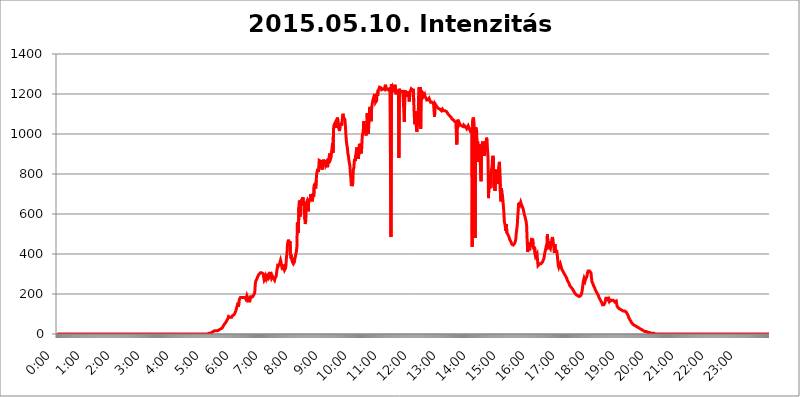
| Category | 2015.05.10. Intenzitás [W/m^2] |
|---|---|
| 0.0 | 0 |
| 0.0006944444444444445 | 0 |
| 0.001388888888888889 | 0 |
| 0.0020833333333333333 | 0 |
| 0.002777777777777778 | 0 |
| 0.003472222222222222 | 0 |
| 0.004166666666666667 | 0 |
| 0.004861111111111111 | 0 |
| 0.005555555555555556 | 0 |
| 0.0062499999999999995 | 0 |
| 0.006944444444444444 | 0 |
| 0.007638888888888889 | 0 |
| 0.008333333333333333 | 0 |
| 0.009027777777777779 | 0 |
| 0.009722222222222222 | 0 |
| 0.010416666666666666 | 0 |
| 0.011111111111111112 | 0 |
| 0.011805555555555555 | 0 |
| 0.012499999999999999 | 0 |
| 0.013194444444444444 | 0 |
| 0.013888888888888888 | 0 |
| 0.014583333333333332 | 0 |
| 0.015277777777777777 | 0 |
| 0.015972222222222224 | 0 |
| 0.016666666666666666 | 0 |
| 0.017361111111111112 | 0 |
| 0.018055555555555557 | 0 |
| 0.01875 | 0 |
| 0.019444444444444445 | 0 |
| 0.02013888888888889 | 0 |
| 0.020833333333333332 | 0 |
| 0.02152777777777778 | 0 |
| 0.022222222222222223 | 0 |
| 0.02291666666666667 | 0 |
| 0.02361111111111111 | 0 |
| 0.024305555555555556 | 0 |
| 0.024999999999999998 | 0 |
| 0.025694444444444447 | 0 |
| 0.02638888888888889 | 0 |
| 0.027083333333333334 | 0 |
| 0.027777777777777776 | 0 |
| 0.02847222222222222 | 0 |
| 0.029166666666666664 | 0 |
| 0.029861111111111113 | 0 |
| 0.030555555555555555 | 0 |
| 0.03125 | 0 |
| 0.03194444444444445 | 0 |
| 0.03263888888888889 | 0 |
| 0.03333333333333333 | 0 |
| 0.034027777777777775 | 0 |
| 0.034722222222222224 | 0 |
| 0.035416666666666666 | 0 |
| 0.036111111111111115 | 0 |
| 0.03680555555555556 | 0 |
| 0.0375 | 0 |
| 0.03819444444444444 | 0 |
| 0.03888888888888889 | 0 |
| 0.03958333333333333 | 0 |
| 0.04027777777777778 | 0 |
| 0.04097222222222222 | 0 |
| 0.041666666666666664 | 0 |
| 0.042361111111111106 | 0 |
| 0.04305555555555556 | 0 |
| 0.043750000000000004 | 0 |
| 0.044444444444444446 | 0 |
| 0.04513888888888889 | 0 |
| 0.04583333333333334 | 0 |
| 0.04652777777777778 | 0 |
| 0.04722222222222222 | 0 |
| 0.04791666666666666 | 0 |
| 0.04861111111111111 | 0 |
| 0.049305555555555554 | 0 |
| 0.049999999999999996 | 0 |
| 0.05069444444444445 | 0 |
| 0.051388888888888894 | 0 |
| 0.052083333333333336 | 0 |
| 0.05277777777777778 | 0 |
| 0.05347222222222222 | 0 |
| 0.05416666666666667 | 0 |
| 0.05486111111111111 | 0 |
| 0.05555555555555555 | 0 |
| 0.05625 | 0 |
| 0.05694444444444444 | 0 |
| 0.057638888888888885 | 0 |
| 0.05833333333333333 | 0 |
| 0.05902777777777778 | 0 |
| 0.059722222222222225 | 0 |
| 0.06041666666666667 | 0 |
| 0.061111111111111116 | 0 |
| 0.06180555555555556 | 0 |
| 0.0625 | 0 |
| 0.06319444444444444 | 0 |
| 0.06388888888888888 | 0 |
| 0.06458333333333334 | 0 |
| 0.06527777777777778 | 0 |
| 0.06597222222222222 | 0 |
| 0.06666666666666667 | 0 |
| 0.06736111111111111 | 0 |
| 0.06805555555555555 | 0 |
| 0.06874999999999999 | 0 |
| 0.06944444444444443 | 0 |
| 0.07013888888888889 | 0 |
| 0.07083333333333333 | 0 |
| 0.07152777777777779 | 0 |
| 0.07222222222222223 | 0 |
| 0.07291666666666667 | 0 |
| 0.07361111111111111 | 0 |
| 0.07430555555555556 | 0 |
| 0.075 | 0 |
| 0.07569444444444444 | 0 |
| 0.0763888888888889 | 0 |
| 0.07708333333333334 | 0 |
| 0.07777777777777778 | 0 |
| 0.07847222222222222 | 0 |
| 0.07916666666666666 | 0 |
| 0.0798611111111111 | 0 |
| 0.08055555555555556 | 0 |
| 0.08125 | 0 |
| 0.08194444444444444 | 0 |
| 0.08263888888888889 | 0 |
| 0.08333333333333333 | 0 |
| 0.08402777777777777 | 0 |
| 0.08472222222222221 | 0 |
| 0.08541666666666665 | 0 |
| 0.08611111111111112 | 0 |
| 0.08680555555555557 | 0 |
| 0.08750000000000001 | 0 |
| 0.08819444444444445 | 0 |
| 0.08888888888888889 | 0 |
| 0.08958333333333333 | 0 |
| 0.09027777777777778 | 0 |
| 0.09097222222222222 | 0 |
| 0.09166666666666667 | 0 |
| 0.09236111111111112 | 0 |
| 0.09305555555555556 | 0 |
| 0.09375 | 0 |
| 0.09444444444444444 | 0 |
| 0.09513888888888888 | 0 |
| 0.09583333333333333 | 0 |
| 0.09652777777777777 | 0 |
| 0.09722222222222222 | 0 |
| 0.09791666666666667 | 0 |
| 0.09861111111111111 | 0 |
| 0.09930555555555555 | 0 |
| 0.09999999999999999 | 0 |
| 0.10069444444444443 | 0 |
| 0.1013888888888889 | 0 |
| 0.10208333333333335 | 0 |
| 0.10277777777777779 | 0 |
| 0.10347222222222223 | 0 |
| 0.10416666666666667 | 0 |
| 0.10486111111111111 | 0 |
| 0.10555555555555556 | 0 |
| 0.10625 | 0 |
| 0.10694444444444444 | 0 |
| 0.1076388888888889 | 0 |
| 0.10833333333333334 | 0 |
| 0.10902777777777778 | 0 |
| 0.10972222222222222 | 0 |
| 0.1111111111111111 | 0 |
| 0.11180555555555556 | 0 |
| 0.11180555555555556 | 0 |
| 0.1125 | 0 |
| 0.11319444444444444 | 0 |
| 0.11388888888888889 | 0 |
| 0.11458333333333333 | 0 |
| 0.11527777777777777 | 0 |
| 0.11597222222222221 | 0 |
| 0.11666666666666665 | 0 |
| 0.1173611111111111 | 0 |
| 0.11805555555555557 | 0 |
| 0.11944444444444445 | 0 |
| 0.12013888888888889 | 0 |
| 0.12083333333333333 | 0 |
| 0.12152777777777778 | 0 |
| 0.12222222222222223 | 0 |
| 0.12291666666666667 | 0 |
| 0.12291666666666667 | 0 |
| 0.12361111111111112 | 0 |
| 0.12430555555555556 | 0 |
| 0.125 | 0 |
| 0.12569444444444444 | 0 |
| 0.12638888888888888 | 0 |
| 0.12708333333333333 | 0 |
| 0.16875 | 0 |
| 0.12847222222222224 | 0 |
| 0.12916666666666668 | 0 |
| 0.12986111111111112 | 0 |
| 0.13055555555555556 | 0 |
| 0.13125 | 0 |
| 0.13194444444444445 | 0 |
| 0.1326388888888889 | 0 |
| 0.13333333333333333 | 0 |
| 0.13402777777777777 | 0 |
| 0.13402777777777777 | 0 |
| 0.13472222222222222 | 0 |
| 0.13541666666666666 | 0 |
| 0.1361111111111111 | 0 |
| 0.13749999999999998 | 0 |
| 0.13819444444444443 | 0 |
| 0.1388888888888889 | 0 |
| 0.13958333333333334 | 0 |
| 0.14027777777777778 | 0 |
| 0.14097222222222222 | 0 |
| 0.14166666666666666 | 0 |
| 0.1423611111111111 | 0 |
| 0.14305555555555557 | 0 |
| 0.14375000000000002 | 0 |
| 0.14444444444444446 | 0 |
| 0.1451388888888889 | 0 |
| 0.1451388888888889 | 0 |
| 0.14652777777777778 | 0 |
| 0.14722222222222223 | 0 |
| 0.14791666666666667 | 0 |
| 0.1486111111111111 | 0 |
| 0.14930555555555555 | 0 |
| 0.15 | 0 |
| 0.15069444444444444 | 0 |
| 0.15138888888888888 | 0 |
| 0.15208333333333332 | 0 |
| 0.15277777777777776 | 0 |
| 0.15347222222222223 | 0 |
| 0.15416666666666667 | 0 |
| 0.15486111111111112 | 0 |
| 0.15555555555555556 | 0 |
| 0.15625 | 0 |
| 0.15694444444444444 | 0 |
| 0.15763888888888888 | 0 |
| 0.15833333333333333 | 0 |
| 0.15902777777777777 | 0 |
| 0.15972222222222224 | 0 |
| 0.16041666666666668 | 0 |
| 0.16111111111111112 | 0 |
| 0.16180555555555556 | 0 |
| 0.1625 | 0 |
| 0.16319444444444445 | 0 |
| 0.1638888888888889 | 0 |
| 0.16458333333333333 | 0 |
| 0.16527777777777777 | 0 |
| 0.16597222222222222 | 0 |
| 0.16666666666666666 | 0 |
| 0.1673611111111111 | 0 |
| 0.16805555555555554 | 0 |
| 0.16874999999999998 | 0 |
| 0.16944444444444443 | 0 |
| 0.17013888888888887 | 0 |
| 0.1708333333333333 | 0 |
| 0.17152777777777775 | 0 |
| 0.17222222222222225 | 0 |
| 0.1729166666666667 | 0 |
| 0.17361111111111113 | 0 |
| 0.17430555555555557 | 0 |
| 0.17500000000000002 | 0 |
| 0.17569444444444446 | 0 |
| 0.1763888888888889 | 0 |
| 0.17708333333333334 | 0 |
| 0.17777777777777778 | 0 |
| 0.17847222222222223 | 0 |
| 0.17916666666666667 | 0 |
| 0.1798611111111111 | 0 |
| 0.18055555555555555 | 0 |
| 0.18125 | 0 |
| 0.18194444444444444 | 0 |
| 0.1826388888888889 | 0 |
| 0.18333333333333335 | 0 |
| 0.1840277777777778 | 0 |
| 0.18472222222222223 | 0 |
| 0.18541666666666667 | 0 |
| 0.18611111111111112 | 0 |
| 0.18680555555555556 | 0 |
| 0.1875 | 0 |
| 0.18819444444444444 | 0 |
| 0.18888888888888888 | 0 |
| 0.18958333333333333 | 0 |
| 0.19027777777777777 | 0 |
| 0.1909722222222222 | 0 |
| 0.19166666666666665 | 0 |
| 0.19236111111111112 | 0 |
| 0.19305555555555554 | 0 |
| 0.19375 | 0 |
| 0.19444444444444445 | 0 |
| 0.1951388888888889 | 0 |
| 0.19583333333333333 | 0 |
| 0.19652777777777777 | 0 |
| 0.19722222222222222 | 0 |
| 0.19791666666666666 | 0 |
| 0.1986111111111111 | 0 |
| 0.19930555555555554 | 0 |
| 0.19999999999999998 | 0 |
| 0.20069444444444443 | 0 |
| 0.20138888888888887 | 0 |
| 0.2020833333333333 | 0 |
| 0.2027777777777778 | 0 |
| 0.2034722222222222 | 0 |
| 0.2041666666666667 | 0 |
| 0.20486111111111113 | 0 |
| 0.20555555555555557 | 0 |
| 0.20625000000000002 | 0 |
| 0.20694444444444446 | 0 |
| 0.2076388888888889 | 0 |
| 0.20833333333333334 | 0 |
| 0.20902777777777778 | 0 |
| 0.20972222222222223 | 0 |
| 0.21041666666666667 | 0 |
| 0.2111111111111111 | 3.525 |
| 0.21180555555555555 | 3.525 |
| 0.2125 | 3.525 |
| 0.21319444444444444 | 3.525 |
| 0.2138888888888889 | 3.525 |
| 0.21458333333333335 | 3.525 |
| 0.2152777777777778 | 3.525 |
| 0.21597222222222223 | 3.525 |
| 0.21666666666666667 | 7.887 |
| 0.21736111111111112 | 7.887 |
| 0.21805555555555556 | 7.887 |
| 0.21875 | 12.257 |
| 0.21944444444444444 | 12.257 |
| 0.22013888888888888 | 12.257 |
| 0.22083333333333333 | 16.636 |
| 0.22152777777777777 | 16.636 |
| 0.2222222222222222 | 16.636 |
| 0.22291666666666665 | 16.636 |
| 0.2236111111111111 | 16.636 |
| 0.22430555555555556 | 16.636 |
| 0.225 | 16.636 |
| 0.22569444444444445 | 16.636 |
| 0.2263888888888889 | 21.024 |
| 0.22708333333333333 | 21.024 |
| 0.22777777777777777 | 21.024 |
| 0.22847222222222222 | 25.419 |
| 0.22916666666666666 | 25.419 |
| 0.2298611111111111 | 29.823 |
| 0.23055555555555554 | 29.823 |
| 0.23124999999999998 | 29.823 |
| 0.23194444444444443 | 34.234 |
| 0.23263888888888887 | 38.653 |
| 0.2333333333333333 | 43.079 |
| 0.2340277777777778 | 47.511 |
| 0.2347222222222222 | 47.511 |
| 0.2354166666666667 | 51.951 |
| 0.23611111111111113 | 56.398 |
| 0.23680555555555557 | 60.85 |
| 0.23750000000000002 | 65.31 |
| 0.23819444444444446 | 65.31 |
| 0.2388888888888889 | 69.775 |
| 0.23958333333333334 | 78.722 |
| 0.24027777777777778 | 87.692 |
| 0.24097222222222223 | 92.184 |
| 0.24166666666666667 | 83.205 |
| 0.2423611111111111 | 83.205 |
| 0.24305555555555555 | 83.205 |
| 0.24375 | 83.205 |
| 0.24444444444444446 | 83.205 |
| 0.24513888888888888 | 87.692 |
| 0.24583333333333335 | 92.184 |
| 0.2465277777777778 | 92.184 |
| 0.24722222222222223 | 96.682 |
| 0.24791666666666667 | 96.682 |
| 0.24861111111111112 | 101.184 |
| 0.24930555555555556 | 105.69 |
| 0.25 | 110.201 |
| 0.25069444444444444 | 119.235 |
| 0.2513888888888889 | 119.235 |
| 0.2520833333333333 | 119.235 |
| 0.25277777777777777 | 146.423 |
| 0.2534722222222222 | 155.509 |
| 0.25416666666666665 | 137.347 |
| 0.2548611111111111 | 160.056 |
| 0.2555555555555556 | 173.709 |
| 0.25625000000000003 | 178.264 |
| 0.2569444444444445 | 182.82 |
| 0.2576388888888889 | 178.264 |
| 0.25833333333333336 | 178.264 |
| 0.2590277777777778 | 182.82 |
| 0.25972222222222224 | 187.378 |
| 0.2604166666666667 | 182.82 |
| 0.2611111111111111 | 182.82 |
| 0.26180555555555557 | 182.82 |
| 0.2625 | 182.82 |
| 0.26319444444444445 | 182.82 |
| 0.2638888888888889 | 182.82 |
| 0.26458333333333334 | 173.709 |
| 0.2652777777777778 | 178.264 |
| 0.2659722222222222 | 191.937 |
| 0.26666666666666666 | 191.937 |
| 0.2673611111111111 | 178.264 |
| 0.26805555555555555 | 164.605 |
| 0.26875 | 160.056 |
| 0.26944444444444443 | 164.605 |
| 0.2701388888888889 | 164.605 |
| 0.2708333333333333 | 169.156 |
| 0.27152777777777776 | 191.937 |
| 0.2722222222222222 | 182.82 |
| 0.27291666666666664 | 178.264 |
| 0.2736111111111111 | 182.82 |
| 0.2743055555555555 | 187.378 |
| 0.27499999999999997 | 187.378 |
| 0.27569444444444446 | 191.937 |
| 0.27638888888888885 | 201.058 |
| 0.27708333333333335 | 210.182 |
| 0.2777777777777778 | 251.251 |
| 0.27847222222222223 | 264.932 |
| 0.2791666666666667 | 269.49 |
| 0.2798611111111111 | 274.047 |
| 0.28055555555555556 | 278.603 |
| 0.28125 | 287.709 |
| 0.28194444444444444 | 287.709 |
| 0.2826388888888889 | 296.808 |
| 0.2833333333333333 | 292.259 |
| 0.28402777777777777 | 296.808 |
| 0.2847222222222222 | 305.898 |
| 0.28541666666666665 | 310.44 |
| 0.28611111111111115 | 310.44 |
| 0.28680555555555554 | 305.898 |
| 0.28750000000000003 | 301.354 |
| 0.2881944444444445 | 305.898 |
| 0.2888888888888889 | 301.354 |
| 0.28958333333333336 | 283.156 |
| 0.2902777777777778 | 269.49 |
| 0.29097222222222224 | 274.047 |
| 0.2916666666666667 | 278.603 |
| 0.2923611111111111 | 287.709 |
| 0.29305555555555557 | 278.603 |
| 0.29375 | 287.709 |
| 0.29444444444444445 | 292.259 |
| 0.2951388888888889 | 292.259 |
| 0.29583333333333334 | 296.808 |
| 0.2965277777777778 | 278.603 |
| 0.2972222222222222 | 278.603 |
| 0.29791666666666666 | 283.156 |
| 0.2986111111111111 | 287.709 |
| 0.29930555555555555 | 310.44 |
| 0.3 | 292.259 |
| 0.30069444444444443 | 278.603 |
| 0.3013888888888889 | 283.156 |
| 0.3020833333333333 | 287.709 |
| 0.30277777777777776 | 287.709 |
| 0.3034722222222222 | 278.603 |
| 0.30416666666666664 | 274.047 |
| 0.3048611111111111 | 269.49 |
| 0.3055555555555555 | 278.603 |
| 0.30624999999999997 | 274.047 |
| 0.3069444444444444 | 287.709 |
| 0.3076388888888889 | 283.156 |
| 0.30833333333333335 | 324.052 |
| 0.3090277777777778 | 324.052 |
| 0.30972222222222223 | 351.198 |
| 0.3104166666666667 | 342.162 |
| 0.3111111111111111 | 342.162 |
| 0.31180555555555556 | 351.198 |
| 0.3125 | 355.712 |
| 0.31319444444444444 | 369.23 |
| 0.3138888888888889 | 360.221 |
| 0.3145833333333333 | 342.162 |
| 0.31527777777777777 | 342.162 |
| 0.3159722222222222 | 319.517 |
| 0.31666666666666665 | 346.682 |
| 0.31736111111111115 | 346.682 |
| 0.31805555555555554 | 328.584 |
| 0.31875000000000003 | 319.517 |
| 0.3194444444444445 | 314.98 |
| 0.3201388888888889 | 328.584 |
| 0.32083333333333336 | 346.682 |
| 0.3215277777777778 | 387.202 |
| 0.32222222222222224 | 400.638 |
| 0.3229166666666667 | 449.551 |
| 0.3236111111111111 | 453.968 |
| 0.32430555555555557 | 471.582 |
| 0.325 | 475.972 |
| 0.32569444444444445 | 440.702 |
| 0.3263888888888889 | 462.786 |
| 0.32708333333333334 | 400.638 |
| 0.3277777777777778 | 378.224 |
| 0.3284722222222222 | 396.164 |
| 0.32916666666666666 | 369.23 |
| 0.3298611111111111 | 360.221 |
| 0.33055555555555555 | 355.712 |
| 0.33125 | 351.198 |
| 0.33194444444444443 | 355.712 |
| 0.3326388888888889 | 360.221 |
| 0.3333333333333333 | 378.224 |
| 0.3340277777777778 | 387.202 |
| 0.3347222222222222 | 387.202 |
| 0.3354166666666667 | 414.035 |
| 0.3361111111111111 | 436.27 |
| 0.3368055555555556 | 558.261 |
| 0.33749999999999997 | 528.2 |
| 0.33819444444444446 | 506.542 |
| 0.33888888888888885 | 634.105 |
| 0.33958333333333335 | 667.123 |
| 0.34027777777777773 | 671.22 |
| 0.34097222222222223 | 588.009 |
| 0.3416666666666666 | 613.252 |
| 0.3423611111111111 | 663.019 |
| 0.3430555555555555 | 675.311 |
| 0.34375 | 658.909 |
| 0.3444444444444445 | 683.473 |
| 0.3451388888888889 | 667.123 |
| 0.3458333333333334 | 642.4 |
| 0.34652777777777777 | 658.909 |
| 0.34722222222222227 | 575.299 |
| 0.34791666666666665 | 549.704 |
| 0.34861111111111115 | 571.049 |
| 0.34930555555555554 | 654.791 |
| 0.35000000000000003 | 650.667 |
| 0.3506944444444444 | 667.123 |
| 0.3513888888888889 | 658.909 |
| 0.3520833333333333 | 613.252 |
| 0.3527777777777778 | 671.22 |
| 0.3534722222222222 | 675.311 |
| 0.3541666666666667 | 667.123 |
| 0.3548611111111111 | 671.22 |
| 0.35555555555555557 | 699.717 |
| 0.35625 | 679.395 |
| 0.35694444444444445 | 671.22 |
| 0.3576388888888889 | 663.019 |
| 0.35833333333333334 | 679.395 |
| 0.3590277777777778 | 703.762 |
| 0.3597222222222222 | 687.544 |
| 0.36041666666666666 | 743.859 |
| 0.3611111111111111 | 751.803 |
| 0.36180555555555555 | 739.877 |
| 0.3625 | 727.896 |
| 0.36319444444444443 | 767.62 |
| 0.3638888888888889 | 802.868 |
| 0.3645833333333333 | 810.641 |
| 0.3652777777777778 | 826.123 |
| 0.3659722222222222 | 810.641 |
| 0.3666666666666667 | 822.26 |
| 0.3673611111111111 | 868.305 |
| 0.3680555555555556 | 872.114 |
| 0.36874999999999997 | 872.114 |
| 0.36944444444444446 | 864.493 |
| 0.37013888888888885 | 856.855 |
| 0.37083333333333335 | 837.682 |
| 0.37152777777777773 | 822.26 |
| 0.37222222222222223 | 845.365 |
| 0.3729166666666666 | 849.199 |
| 0.3736111111111111 | 872.114 |
| 0.3743055555555555 | 860.676 |
| 0.375 | 868.305 |
| 0.3756944444444445 | 868.305 |
| 0.3763888888888889 | 841.526 |
| 0.3770833333333334 | 837.682 |
| 0.37777777777777777 | 845.365 |
| 0.37847222222222227 | 856.855 |
| 0.37916666666666665 | 833.834 |
| 0.37986111111111115 | 875.918 |
| 0.38055555555555554 | 853.029 |
| 0.38125000000000003 | 879.719 |
| 0.3819444444444444 | 902.447 |
| 0.3826388888888889 | 883.516 |
| 0.3833333333333333 | 875.918 |
| 0.3840277777777778 | 883.516 |
| 0.3847222222222222 | 909.996 |
| 0.3854166666666667 | 928.819 |
| 0.3861111111111111 | 955.071 |
| 0.38680555555555557 | 906.223 |
| 0.3875 | 1026.06 |
| 0.38819444444444445 | 1044.762 |
| 0.3888888888888889 | 1041.019 |
| 0.38958333333333334 | 1048.508 |
| 0.3902777777777778 | 1059.756 |
| 0.3909722222222222 | 1044.762 |
| 0.39166666666666666 | 1029.798 |
| 0.3923611111111111 | 1048.508 |
| 0.39305555555555555 | 1082.324 |
| 0.39375 | 1059.756 |
| 0.39444444444444443 | 1037.277 |
| 0.3951388888888889 | 1026.06 |
| 0.3958333333333333 | 1014.852 |
| 0.3965277777777778 | 1033.537 |
| 0.3972222222222222 | 1044.762 |
| 0.3979166666666667 | 1056.004 |
| 0.3986111111111111 | 1041.019 |
| 0.3993055555555556 | 1056.004 |
| 0.39999999999999997 | 1078.555 |
| 0.40069444444444446 | 1101.226 |
| 0.40138888888888885 | 1086.097 |
| 0.40208333333333335 | 1086.097 |
| 0.40277777777777773 | 1086.097 |
| 0.40347222222222223 | 1071.027 |
| 0.4041666666666666 | 1037.277 |
| 0.4048611111111111 | 996.182 |
| 0.4055555555555555 | 962.555 |
| 0.40625 | 943.832 |
| 0.4069444444444445 | 928.819 |
| 0.4076388888888889 | 902.447 |
| 0.4083333333333334 | 891.099 |
| 0.40902777777777777 | 868.305 |
| 0.40972222222222227 | 864.493 |
| 0.41041666666666665 | 841.526 |
| 0.41111111111111115 | 806.757 |
| 0.41180555555555554 | 779.42 |
| 0.41250000000000003 | 739.877 |
| 0.4131944444444444 | 747.834 |
| 0.4138888888888889 | 739.877 |
| 0.4145833333333333 | 763.674 |
| 0.4152777777777778 | 822.26 |
| 0.4159722222222222 | 829.981 |
| 0.4166666666666667 | 864.493 |
| 0.4173611111111111 | 875.918 |
| 0.41805555555555557 | 864.493 |
| 0.41875 | 894.885 |
| 0.41944444444444445 | 913.766 |
| 0.4201388888888889 | 932.576 |
| 0.42083333333333334 | 909.996 |
| 0.4215277777777778 | 902.447 |
| 0.4222222222222222 | 875.918 |
| 0.42291666666666666 | 902.447 |
| 0.4236111111111111 | 951.327 |
| 0.42430555555555555 | 951.327 |
| 0.425 | 940.082 |
| 0.42569444444444443 | 909.996 |
| 0.4263888888888889 | 902.447 |
| 0.4270833333333333 | 936.33 |
| 0.4277777777777778 | 988.714 |
| 0.4284722222222222 | 1003.65 |
| 0.4291666666666667 | 1011.118 |
| 0.4298611111111111 | 1063.51 |
| 0.4305555555555556 | 1018.587 |
| 0.43124999999999997 | 1041.019 |
| 0.43194444444444446 | 1044.762 |
| 0.43263888888888885 | 999.916 |
| 0.43333333333333335 | 992.448 |
| 0.43402777777777773 | 1044.762 |
| 0.43472222222222223 | 1105.019 |
| 0.4354166666666666 | 1041.019 |
| 0.4361111111111111 | 999.916 |
| 0.4368055555555555 | 1033.537 |
| 0.4375 | 1082.324 |
| 0.4381944444444445 | 1135.543 |
| 0.4388888888888889 | 1127.879 |
| 0.4395833333333334 | 1097.437 |
| 0.44027777777777777 | 1063.51 |
| 0.44097222222222227 | 1131.708 |
| 0.44166666666666665 | 1131.708 |
| 0.44236111111111115 | 1162.571 |
| 0.44305555555555554 | 1174.263 |
| 0.44375000000000003 | 1182.099 |
| 0.4444444444444444 | 1174.263 |
| 0.4451388888888889 | 1186.03 |
| 0.4458333333333333 | 1197.876 |
| 0.4465277777777778 | 1158.689 |
| 0.4472222222222222 | 1154.814 |
| 0.4479166666666667 | 1166.46 |
| 0.4486111111111111 | 1205.82 |
| 0.44930555555555557 | 1189.969 |
| 0.45 | 1217.812 |
| 0.45069444444444445 | 1221.83 |
| 0.4513888888888889 | 1225.859 |
| 0.45208333333333334 | 1233.951 |
| 0.4527777777777778 | 1233.951 |
| 0.4534722222222222 | 1229.899 |
| 0.45416666666666666 | 1229.899 |
| 0.4548611111111111 | 1221.83 |
| 0.45555555555555555 | 1225.859 |
| 0.45625 | 1225.859 |
| 0.45694444444444443 | 1225.859 |
| 0.4576388888888889 | 1225.859 |
| 0.4583333333333333 | 1225.859 |
| 0.4590277777777778 | 1221.83 |
| 0.4597222222222222 | 1238.014 |
| 0.4604166666666667 | 1246.176 |
| 0.4611111111111111 | 1229.899 |
| 0.4618055555555556 | 1225.859 |
| 0.46249999999999997 | 1225.859 |
| 0.46319444444444446 | 1221.83 |
| 0.46388888888888885 | 1217.812 |
| 0.46458333333333335 | 1217.812 |
| 0.46527777777777773 | 1225.859 |
| 0.46597222222222223 | 1221.83 |
| 0.4666666666666666 | 1209.807 |
| 0.4673611111111111 | 1213.804 |
| 0.4680555555555555 | 484.735 |
| 0.46875 | 1250.275 |
| 0.4694444444444445 | 1225.859 |
| 0.4701388888888889 | 1233.951 |
| 0.4708333333333334 | 1225.859 |
| 0.47152777777777777 | 1225.859 |
| 0.47222222222222227 | 1217.812 |
| 0.47291666666666665 | 1238.014 |
| 0.47361111111111115 | 1246.176 |
| 0.47430555555555554 | 1229.899 |
| 0.47500000000000003 | 1225.859 |
| 0.4756944444444444 | 1225.859 |
| 0.4763888888888889 | 1197.876 |
| 0.4770833333333333 | 1209.807 |
| 0.4777777777777778 | 1221.83 |
| 0.4784722222222222 | 1213.804 |
| 0.4791666666666667 | 879.719 |
| 0.4798611111111111 | 1225.859 |
| 0.48055555555555557 | 1209.807 |
| 0.48125 | 1209.807 |
| 0.48194444444444445 | 1209.807 |
| 0.4826388888888889 | 1213.804 |
| 0.48333333333333334 | 1213.804 |
| 0.4840277777777778 | 1213.804 |
| 0.4847222222222222 | 1213.804 |
| 0.48541666666666666 | 1209.807 |
| 0.4861111111111111 | 1209.807 |
| 0.48680555555555555 | 1059.756 |
| 0.4875 | 1217.812 |
| 0.48819444444444443 | 1209.807 |
| 0.4888888888888889 | 1186.03 |
| 0.4895833333333333 | 1193.918 |
| 0.4902777777777778 | 1189.969 |
| 0.4909722222222222 | 1193.918 |
| 0.4916666666666667 | 1213.804 |
| 0.4923611111111111 | 1193.918 |
| 0.4930555555555556 | 1186.03 |
| 0.49374999999999997 | 1162.571 |
| 0.49444444444444446 | 1197.876 |
| 0.49513888888888885 | 1213.804 |
| 0.49583333333333335 | 1217.812 |
| 0.49652777777777773 | 1225.859 |
| 0.49722222222222223 | 1221.83 |
| 0.4979166666666666 | 1221.83 |
| 0.4986111111111111 | 1217.812 |
| 0.4993055555555555 | 1225.859 |
| 0.5 | 1162.571 |
| 0.5006944444444444 | 1097.437 |
| 0.5013888888888889 | 1048.508 |
| 0.5020833333333333 | 1112.618 |
| 0.5027777777777778 | 1097.437 |
| 0.5034722222222222 | 1044.762 |
| 0.5041666666666667 | 1011.118 |
| 0.5048611111111111 | 1018.587 |
| 0.5055555555555555 | 1078.555 |
| 0.50625 | 1086.097 |
| 0.5069444444444444 | 1209.807 |
| 0.5076388888888889 | 1233.951 |
| 0.5083333333333333 | 1197.876 |
| 0.5090277777777777 | 1233.951 |
| 0.5097222222222222 | 1026.06 |
| 0.5104166666666666 | 1217.812 |
| 0.5111111111111112 | 1217.812 |
| 0.5118055555555555 | 1213.804 |
| 0.5125000000000001 | 1201.843 |
| 0.5131944444444444 | 1186.03 |
| 0.513888888888889 | 1186.03 |
| 0.5145833333333333 | 1182.099 |
| 0.5152777777777778 | 1197.876 |
| 0.5159722222222222 | 1186.03 |
| 0.5166666666666667 | 1182.099 |
| 0.517361111111111 | 1178.177 |
| 0.5180555555555556 | 1170.358 |
| 0.5187499999999999 | 1170.358 |
| 0.5194444444444445 | 1166.46 |
| 0.5201388888888888 | 1170.358 |
| 0.5208333333333334 | 1174.263 |
| 0.5215277777777778 | 1178.177 |
| 0.5222222222222223 | 1174.263 |
| 0.5229166666666667 | 1166.46 |
| 0.5236111111111111 | 1158.689 |
| 0.5243055555555556 | 1154.814 |
| 0.525 | 1162.571 |
| 0.5256944444444445 | 1158.689 |
| 0.5263888888888889 | 1154.814 |
| 0.5270833333333333 | 1154.814 |
| 0.5277777777777778 | 1150.946 |
| 0.5284722222222222 | 1150.946 |
| 0.5291666666666667 | 1086.097 |
| 0.5298611111111111 | 1150.946 |
| 0.5305555555555556 | 1147.086 |
| 0.53125 | 1143.232 |
| 0.5319444444444444 | 1139.384 |
| 0.5326388888888889 | 1135.543 |
| 0.5333333333333333 | 1135.543 |
| 0.5340277777777778 | 1131.708 |
| 0.5347222222222222 | 1127.879 |
| 0.5354166666666667 | 1124.056 |
| 0.5361111111111111 | 1127.879 |
| 0.5368055555555555 | 1124.056 |
| 0.5375 | 1124.056 |
| 0.5381944444444444 | 1120.238 |
| 0.5388888888888889 | 1116.426 |
| 0.5395833333333333 | 1120.238 |
| 0.5402777777777777 | 1124.056 |
| 0.5409722222222222 | 1120.238 |
| 0.5416666666666666 | 1116.426 |
| 0.5423611111111112 | 1120.238 |
| 0.5430555555555555 | 1120.238 |
| 0.5437500000000001 | 1116.426 |
| 0.5444444444444444 | 1120.238 |
| 0.545138888888889 | 1112.618 |
| 0.5458333333333333 | 1112.618 |
| 0.5465277777777778 | 1108.816 |
| 0.5472222222222222 | 1105.019 |
| 0.5479166666666667 | 1101.226 |
| 0.548611111111111 | 1097.437 |
| 0.5493055555555556 | 1097.437 |
| 0.5499999999999999 | 1093.653 |
| 0.5506944444444445 | 1089.873 |
| 0.5513888888888888 | 1089.873 |
| 0.5520833333333334 | 1086.097 |
| 0.5527777777777778 | 1082.324 |
| 0.5534722222222223 | 1074.789 |
| 0.5541666666666667 | 1074.789 |
| 0.5548611111111111 | 1071.027 |
| 0.5555555555555556 | 1071.027 |
| 0.55625 | 1067.267 |
| 0.5569444444444445 | 1063.51 |
| 0.5576388888888889 | 1063.51 |
| 0.5583333333333333 | 1059.756 |
| 0.5590277777777778 | 1059.756 |
| 0.5597222222222222 | 1056.004 |
| 0.5604166666666667 | 947.58 |
| 0.5611111111111111 | 1071.027 |
| 0.5618055555555556 | 1063.51 |
| 0.5625 | 1056.004 |
| 0.5631944444444444 | 1048.508 |
| 0.5638888888888889 | 1056.004 |
| 0.5645833333333333 | 1056.004 |
| 0.5652777777777778 | 1044.762 |
| 0.5659722222222222 | 1048.508 |
| 0.5666666666666667 | 1044.762 |
| 0.5673611111111111 | 1041.019 |
| 0.5680555555555555 | 1044.762 |
| 0.56875 | 1037.277 |
| 0.5694444444444444 | 1037.277 |
| 0.5701388888888889 | 1044.762 |
| 0.5708333333333333 | 1044.762 |
| 0.5715277777777777 | 1041.019 |
| 0.5722222222222222 | 1037.277 |
| 0.5729166666666666 | 1037.277 |
| 0.5736111111111112 | 1033.537 |
| 0.5743055555555555 | 1026.06 |
| 0.5750000000000001 | 1022.323 |
| 0.5756944444444444 | 1022.323 |
| 0.576388888888889 | 1041.019 |
| 0.5770833333333333 | 1037.277 |
| 0.5777777777777778 | 1029.798 |
| 0.5784722222222222 | 1022.323 |
| 0.5791666666666667 | 1014.852 |
| 0.579861111111111 | 1018.587 |
| 0.5805555555555556 | 1011.118 |
| 0.5812499999999999 | 1018.587 |
| 0.5819444444444445 | 436.27 |
| 0.5826388888888888 | 1067.267 |
| 0.5833333333333334 | 1082.324 |
| 0.5840277777777778 | 1074.789 |
| 0.5847222222222223 | 1044.762 |
| 0.5854166666666667 | 1041.019 |
| 0.5861111111111111 | 480.356 |
| 0.5868055555555556 | 1033.537 |
| 0.5875 | 1033.537 |
| 0.5881944444444445 | 1014.852 |
| 0.5888888888888889 | 943.832 |
| 0.5895833333333333 | 962.555 |
| 0.5902777777777778 | 940.082 |
| 0.5909722222222222 | 860.676 |
| 0.5916666666666667 | 898.668 |
| 0.5923611111111111 | 947.58 |
| 0.5930555555555556 | 898.668 |
| 0.59375 | 806.757 |
| 0.5944444444444444 | 763.674 |
| 0.5951388888888889 | 932.576 |
| 0.5958333333333333 | 932.576 |
| 0.5965277777777778 | 962.555 |
| 0.5972222222222222 | 894.885 |
| 0.5979166666666667 | 947.58 |
| 0.5986111111111111 | 891.099 |
| 0.5993055555555555 | 898.668 |
| 0.6 | 925.06 |
| 0.6006944444444444 | 962.555 |
| 0.6013888888888889 | 936.33 |
| 0.6020833333333333 | 981.244 |
| 0.6027777777777777 | 966.295 |
| 0.6034722222222222 | 921.298 |
| 0.6041666666666666 | 883.516 |
| 0.6048611111111112 | 679.395 |
| 0.6055555555555555 | 798.974 |
| 0.6062500000000001 | 787.258 |
| 0.6069444444444444 | 727.896 |
| 0.607638888888889 | 723.889 |
| 0.6083333333333333 | 814.519 |
| 0.6090277777777778 | 822.26 |
| 0.6097222222222222 | 833.834 |
| 0.6104166666666667 | 879.719 |
| 0.611111111111111 | 891.099 |
| 0.6118055555555556 | 872.114 |
| 0.6124999999999999 | 731.896 |
| 0.6131944444444445 | 822.26 |
| 0.6138888888888888 | 715.858 |
| 0.6145833333333334 | 779.42 |
| 0.6152777777777778 | 787.258 |
| 0.6159722222222223 | 755.766 |
| 0.6166666666666667 | 767.62 |
| 0.6173611111111111 | 814.519 |
| 0.6180555555555556 | 822.26 |
| 0.61875 | 751.803 |
| 0.6194444444444445 | 841.526 |
| 0.6201388888888889 | 860.676 |
| 0.6208333333333333 | 856.855 |
| 0.6215277777777778 | 711.832 |
| 0.6222222222222222 | 663.019 |
| 0.6229166666666667 | 727.896 |
| 0.6236111111111111 | 707.8 |
| 0.6243055555555556 | 695.666 |
| 0.625 | 671.22 |
| 0.6256944444444444 | 638.256 |
| 0.6263888888888889 | 609.062 |
| 0.6270833333333333 | 562.53 |
| 0.6277777777777778 | 562.53 |
| 0.6284722222222222 | 536.82 |
| 0.6291666666666667 | 515.223 |
| 0.6298611111111111 | 549.704 |
| 0.6305555555555555 | 506.542 |
| 0.63125 | 506.542 |
| 0.6319444444444444 | 502.192 |
| 0.6326388888888889 | 493.475 |
| 0.6333333333333333 | 489.108 |
| 0.6340277777777777 | 480.356 |
| 0.6347222222222222 | 471.582 |
| 0.6354166666666666 | 467.187 |
| 0.6361111111111112 | 462.786 |
| 0.6368055555555555 | 458.38 |
| 0.6375000000000001 | 449.551 |
| 0.6381944444444444 | 449.551 |
| 0.638888888888889 | 445.129 |
| 0.6395833333333333 | 445.129 |
| 0.6402777777777778 | 449.551 |
| 0.6409722222222222 | 449.551 |
| 0.6416666666666667 | 453.968 |
| 0.642361111111111 | 462.786 |
| 0.6430555555555556 | 471.582 |
| 0.6437499999999999 | 502.192 |
| 0.6444444444444445 | 523.88 |
| 0.6451388888888888 | 541.121 |
| 0.6458333333333334 | 583.779 |
| 0.6465277777777778 | 588.009 |
| 0.6472222222222223 | 654.791 |
| 0.6479166666666667 | 646.537 |
| 0.6486111111111111 | 658.909 |
| 0.6493055555555556 | 650.667 |
| 0.65 | 658.909 |
| 0.6506944444444445 | 650.667 |
| 0.6513888888888889 | 646.537 |
| 0.6520833333333333 | 638.256 |
| 0.6527777777777778 | 634.105 |
| 0.6534722222222222 | 625.784 |
| 0.6541666666666667 | 613.252 |
| 0.6548611111111111 | 600.661 |
| 0.6555555555555556 | 592.233 |
| 0.65625 | 583.779 |
| 0.6569444444444444 | 571.049 |
| 0.6576388888888889 | 562.53 |
| 0.6583333333333333 | 541.121 |
| 0.6590277777777778 | 536.82 |
| 0.6597222222222222 | 409.574 |
| 0.6604166666666667 | 458.38 |
| 0.6611111111111111 | 440.702 |
| 0.6618055555555555 | 445.129 |
| 0.6625 | 418.492 |
| 0.6631944444444444 | 445.129 |
| 0.6638888888888889 | 445.129 |
| 0.6645833333333333 | 453.968 |
| 0.6652777777777777 | 480.356 |
| 0.6659722222222222 | 436.27 |
| 0.6666666666666666 | 475.972 |
| 0.6673611111111111 | 449.551 |
| 0.6680555555555556 | 431.833 |
| 0.6687500000000001 | 422.943 |
| 0.6694444444444444 | 436.27 |
| 0.6701388888888888 | 400.638 |
| 0.6708333333333334 | 387.202 |
| 0.6715277777777778 | 391.685 |
| 0.6722222222222222 | 387.202 |
| 0.6729166666666666 | 400.638 |
| 0.6736111111111112 | 369.23 |
| 0.6743055555555556 | 342.162 |
| 0.6749999999999999 | 342.162 |
| 0.6756944444444444 | 342.162 |
| 0.6763888888888889 | 351.198 |
| 0.6770833333333334 | 351.198 |
| 0.6777777777777777 | 351.198 |
| 0.6784722222222223 | 351.198 |
| 0.6791666666666667 | 351.198 |
| 0.6798611111111111 | 355.712 |
| 0.6805555555555555 | 360.221 |
| 0.68125 | 360.221 |
| 0.6819444444444445 | 364.728 |
| 0.6826388888888889 | 378.224 |
| 0.6833333333333332 | 396.164 |
| 0.6840277777777778 | 409.574 |
| 0.6847222222222222 | 418.492 |
| 0.6854166666666667 | 431.833 |
| 0.686111111111111 | 445.129 |
| 0.6868055555555556 | 422.943 |
| 0.6875 | 497.836 |
| 0.6881944444444444 | 445.129 |
| 0.688888888888889 | 462.786 |
| 0.6895833333333333 | 449.551 |
| 0.6902777777777778 | 436.27 |
| 0.6909722222222222 | 436.27 |
| 0.6916666666666668 | 427.39 |
| 0.6923611111111111 | 427.39 |
| 0.6930555555555555 | 458.38 |
| 0.69375 | 458.38 |
| 0.6944444444444445 | 484.735 |
| 0.6951388888888889 | 471.582 |
| 0.6958333333333333 | 471.582 |
| 0.6965277777777777 | 431.833 |
| 0.6972222222222223 | 405.108 |
| 0.6979166666666666 | 449.551 |
| 0.6986111111111111 | 414.035 |
| 0.6993055555555556 | 418.492 |
| 0.7000000000000001 | 418.492 |
| 0.7006944444444444 | 414.035 |
| 0.7013888888888888 | 391.685 |
| 0.7020833333333334 | 364.728 |
| 0.7027777777777778 | 342.162 |
| 0.7034722222222222 | 333.113 |
| 0.7041666666666666 | 337.639 |
| 0.7048611111111112 | 337.639 |
| 0.7055555555555556 | 351.198 |
| 0.7062499999999999 | 346.682 |
| 0.7069444444444444 | 333.113 |
| 0.7076388888888889 | 324.052 |
| 0.7083333333333334 | 319.517 |
| 0.7090277777777777 | 314.98 |
| 0.7097222222222223 | 310.44 |
| 0.7104166666666667 | 305.898 |
| 0.7111111111111111 | 301.354 |
| 0.7118055555555555 | 296.808 |
| 0.7125 | 292.259 |
| 0.7131944444444445 | 287.709 |
| 0.7138888888888889 | 283.156 |
| 0.7145833333333332 | 278.603 |
| 0.7152777777777778 | 269.49 |
| 0.7159722222222222 | 264.932 |
| 0.7166666666666667 | 260.373 |
| 0.717361111111111 | 255.813 |
| 0.7180555555555556 | 251.251 |
| 0.71875 | 242.127 |
| 0.7194444444444444 | 237.564 |
| 0.720138888888889 | 237.564 |
| 0.7208333333333333 | 233 |
| 0.7215277777777778 | 233 |
| 0.7222222222222222 | 228.436 |
| 0.7229166666666668 | 223.873 |
| 0.7236111111111111 | 219.309 |
| 0.7243055555555555 | 214.746 |
| 0.725 | 210.182 |
| 0.7256944444444445 | 205.62 |
| 0.7263888888888889 | 201.058 |
| 0.7270833333333333 | 201.058 |
| 0.7277777777777777 | 196.497 |
| 0.7284722222222223 | 191.937 |
| 0.7291666666666666 | 191.937 |
| 0.7298611111111111 | 191.937 |
| 0.7305555555555556 | 187.378 |
| 0.7312500000000001 | 187.378 |
| 0.7319444444444444 | 187.378 |
| 0.7326388888888888 | 187.378 |
| 0.7333333333333334 | 187.378 |
| 0.7340277777777778 | 191.937 |
| 0.7347222222222222 | 191.937 |
| 0.7354166666666666 | 201.058 |
| 0.7361111111111112 | 214.746 |
| 0.7368055555555556 | 233 |
| 0.7374999999999999 | 255.813 |
| 0.7381944444444444 | 269.49 |
| 0.7388888888888889 | 278.603 |
| 0.7395833333333334 | 278.603 |
| 0.7402777777777777 | 264.932 |
| 0.7409722222222223 | 274.047 |
| 0.7416666666666667 | 274.047 |
| 0.7423611111111111 | 283.156 |
| 0.7430555555555555 | 292.259 |
| 0.74375 | 305.898 |
| 0.7444444444444445 | 314.98 |
| 0.7451388888888889 | 314.98 |
| 0.7458333333333332 | 314.98 |
| 0.7465277777777778 | 314.98 |
| 0.7472222222222222 | 314.98 |
| 0.7479166666666667 | 314.98 |
| 0.748611111111111 | 305.898 |
| 0.7493055555555556 | 278.603 |
| 0.75 | 260.373 |
| 0.7506944444444444 | 255.813 |
| 0.751388888888889 | 251.251 |
| 0.7520833333333333 | 242.127 |
| 0.7527777777777778 | 242.127 |
| 0.7534722222222222 | 233 |
| 0.7541666666666668 | 228.436 |
| 0.7548611111111111 | 219.309 |
| 0.7555555555555555 | 214.746 |
| 0.75625 | 210.182 |
| 0.7569444444444445 | 205.62 |
| 0.7576388888888889 | 201.058 |
| 0.7583333333333333 | 196.497 |
| 0.7590277777777777 | 191.937 |
| 0.7597222222222223 | 182.82 |
| 0.7604166666666666 | 178.264 |
| 0.7611111111111111 | 173.709 |
| 0.7618055555555556 | 169.156 |
| 0.7625000000000001 | 164.605 |
| 0.7631944444444444 | 160.056 |
| 0.7638888888888888 | 155.509 |
| 0.7645833333333334 | 146.423 |
| 0.7652777777777778 | 146.423 |
| 0.7659722222222222 | 146.423 |
| 0.7666666666666666 | 146.423 |
| 0.7673611111111112 | 146.423 |
| 0.7680555555555556 | 155.509 |
| 0.7687499999999999 | 160.056 |
| 0.7694444444444444 | 178.264 |
| 0.7701388888888889 | 182.82 |
| 0.7708333333333334 | 178.264 |
| 0.7715277777777777 | 178.264 |
| 0.7722222222222223 | 178.264 |
| 0.7729166666666667 | 173.709 |
| 0.7736111111111111 | 164.605 |
| 0.7743055555555555 | 173.709 |
| 0.775 | 173.709 |
| 0.7756944444444445 | 164.605 |
| 0.7763888888888889 | 164.605 |
| 0.7770833333333332 | 169.156 |
| 0.7777777777777778 | 169.156 |
| 0.7784722222222222 | 173.709 |
| 0.7791666666666667 | 173.709 |
| 0.779861111111111 | 169.156 |
| 0.7805555555555556 | 164.605 |
| 0.78125 | 164.605 |
| 0.7819444444444444 | 160.056 |
| 0.782638888888889 | 160.056 |
| 0.7833333333333333 | 155.509 |
| 0.7840277777777778 | 164.605 |
| 0.7847222222222222 | 146.423 |
| 0.7854166666666668 | 137.347 |
| 0.7861111111111111 | 137.347 |
| 0.7868055555555555 | 132.814 |
| 0.7875 | 128.284 |
| 0.7881944444444445 | 123.758 |
| 0.7888888888888889 | 128.284 |
| 0.7895833333333333 | 123.758 |
| 0.7902777777777777 | 119.235 |
| 0.7909722222222223 | 119.235 |
| 0.7916666666666666 | 119.235 |
| 0.7923611111111111 | 114.716 |
| 0.7930555555555556 | 114.716 |
| 0.7937500000000001 | 114.716 |
| 0.7944444444444444 | 114.716 |
| 0.7951388888888888 | 114.716 |
| 0.7958333333333334 | 114.716 |
| 0.7965277777777778 | 114.716 |
| 0.7972222222222222 | 114.716 |
| 0.7979166666666666 | 110.201 |
| 0.7986111111111112 | 105.69 |
| 0.7993055555555556 | 101.184 |
| 0.7999999999999999 | 101.184 |
| 0.8006944444444444 | 92.184 |
| 0.8013888888888889 | 83.205 |
| 0.8020833333333334 | 78.722 |
| 0.8027777777777777 | 74.246 |
| 0.8034722222222223 | 69.775 |
| 0.8041666666666667 | 65.31 |
| 0.8048611111111111 | 60.85 |
| 0.8055555555555555 | 56.398 |
| 0.80625 | 56.398 |
| 0.8069444444444445 | 51.951 |
| 0.8076388888888889 | 47.511 |
| 0.8083333333333332 | 47.511 |
| 0.8090277777777778 | 43.079 |
| 0.8097222222222222 | 43.079 |
| 0.8104166666666667 | 43.079 |
| 0.811111111111111 | 43.079 |
| 0.8118055555555556 | 38.653 |
| 0.8125 | 38.653 |
| 0.8131944444444444 | 34.234 |
| 0.813888888888889 | 34.234 |
| 0.8145833333333333 | 29.823 |
| 0.8152777777777778 | 29.823 |
| 0.8159722222222222 | 29.823 |
| 0.8166666666666668 | 29.823 |
| 0.8173611111111111 | 25.419 |
| 0.8180555555555555 | 25.419 |
| 0.81875 | 21.024 |
| 0.8194444444444445 | 21.024 |
| 0.8201388888888889 | 21.024 |
| 0.8208333333333333 | 16.636 |
| 0.8215277777777777 | 16.636 |
| 0.8222222222222223 | 16.636 |
| 0.8229166666666666 | 12.257 |
| 0.8236111111111111 | 12.257 |
| 0.8243055555555556 | 12.257 |
| 0.8250000000000001 | 12.257 |
| 0.8256944444444444 | 12.257 |
| 0.8263888888888888 | 12.257 |
| 0.8270833333333334 | 12.257 |
| 0.8277777777777778 | 12.257 |
| 0.8284722222222222 | 7.887 |
| 0.8291666666666666 | 7.887 |
| 0.8298611111111112 | 7.887 |
| 0.8305555555555556 | 7.887 |
| 0.8312499999999999 | 7.887 |
| 0.8319444444444444 | 3.525 |
| 0.8326388888888889 | 3.525 |
| 0.8333333333333334 | 3.525 |
| 0.8340277777777777 | 3.525 |
| 0.8347222222222223 | 3.525 |
| 0.8354166666666667 | 3.525 |
| 0.8361111111111111 | 3.525 |
| 0.8368055555555555 | 3.525 |
| 0.8375 | 3.525 |
| 0.8381944444444445 | 0 |
| 0.8388888888888889 | 0 |
| 0.8395833333333332 | 0 |
| 0.8402777777777778 | 0 |
| 0.8409722222222222 | 0 |
| 0.8416666666666667 | 0 |
| 0.842361111111111 | 0 |
| 0.8430555555555556 | 0 |
| 0.84375 | 0 |
| 0.8444444444444444 | 0 |
| 0.845138888888889 | 0 |
| 0.8458333333333333 | 0 |
| 0.8465277777777778 | 0 |
| 0.8472222222222222 | 0 |
| 0.8479166666666668 | 0 |
| 0.8486111111111111 | 0 |
| 0.8493055555555555 | 0 |
| 0.85 | 0 |
| 0.8506944444444445 | 0 |
| 0.8513888888888889 | 0 |
| 0.8520833333333333 | 0 |
| 0.8527777777777777 | 0 |
| 0.8534722222222223 | 0 |
| 0.8541666666666666 | 0 |
| 0.8548611111111111 | 0 |
| 0.8555555555555556 | 0 |
| 0.8562500000000001 | 0 |
| 0.8569444444444444 | 0 |
| 0.8576388888888888 | 0 |
| 0.8583333333333334 | 0 |
| 0.8590277777777778 | 0 |
| 0.8597222222222222 | 0 |
| 0.8604166666666666 | 0 |
| 0.8611111111111112 | 0 |
| 0.8618055555555556 | 0 |
| 0.8624999999999999 | 0 |
| 0.8631944444444444 | 0 |
| 0.8638888888888889 | 0 |
| 0.8645833333333334 | 0 |
| 0.8652777777777777 | 0 |
| 0.8659722222222223 | 0 |
| 0.8666666666666667 | 0 |
| 0.8673611111111111 | 0 |
| 0.8680555555555555 | 0 |
| 0.86875 | 0 |
| 0.8694444444444445 | 0 |
| 0.8701388888888889 | 0 |
| 0.8708333333333332 | 0 |
| 0.8715277777777778 | 0 |
| 0.8722222222222222 | 0 |
| 0.8729166666666667 | 0 |
| 0.873611111111111 | 0 |
| 0.8743055555555556 | 0 |
| 0.875 | 0 |
| 0.8756944444444444 | 0 |
| 0.876388888888889 | 0 |
| 0.8770833333333333 | 0 |
| 0.8777777777777778 | 0 |
| 0.8784722222222222 | 0 |
| 0.8791666666666668 | 0 |
| 0.8798611111111111 | 0 |
| 0.8805555555555555 | 0 |
| 0.88125 | 0 |
| 0.8819444444444445 | 0 |
| 0.8826388888888889 | 0 |
| 0.8833333333333333 | 0 |
| 0.8840277777777777 | 0 |
| 0.8847222222222223 | 0 |
| 0.8854166666666666 | 0 |
| 0.8861111111111111 | 0 |
| 0.8868055555555556 | 0 |
| 0.8875000000000001 | 0 |
| 0.8881944444444444 | 0 |
| 0.8888888888888888 | 0 |
| 0.8895833333333334 | 0 |
| 0.8902777777777778 | 0 |
| 0.8909722222222222 | 0 |
| 0.8916666666666666 | 0 |
| 0.8923611111111112 | 0 |
| 0.8930555555555556 | 0 |
| 0.8937499999999999 | 0 |
| 0.8944444444444444 | 0 |
| 0.8951388888888889 | 0 |
| 0.8958333333333334 | 0 |
| 0.8965277777777777 | 0 |
| 0.8972222222222223 | 0 |
| 0.8979166666666667 | 0 |
| 0.8986111111111111 | 0 |
| 0.8993055555555555 | 0 |
| 0.9 | 0 |
| 0.9006944444444445 | 0 |
| 0.9013888888888889 | 0 |
| 0.9020833333333332 | 0 |
| 0.9027777777777778 | 0 |
| 0.9034722222222222 | 0 |
| 0.9041666666666667 | 0 |
| 0.904861111111111 | 0 |
| 0.9055555555555556 | 0 |
| 0.90625 | 0 |
| 0.9069444444444444 | 0 |
| 0.907638888888889 | 0 |
| 0.9083333333333333 | 0 |
| 0.9090277777777778 | 0 |
| 0.9097222222222222 | 0 |
| 0.9104166666666668 | 0 |
| 0.9111111111111111 | 0 |
| 0.9118055555555555 | 0 |
| 0.9125 | 0 |
| 0.9131944444444445 | 0 |
| 0.9138888888888889 | 0 |
| 0.9145833333333333 | 0 |
| 0.9152777777777777 | 0 |
| 0.9159722222222223 | 0 |
| 0.9166666666666666 | 0 |
| 0.9173611111111111 | 0 |
| 0.9180555555555556 | 0 |
| 0.9187500000000001 | 0 |
| 0.9194444444444444 | 0 |
| 0.9201388888888888 | 0 |
| 0.9208333333333334 | 0 |
| 0.9215277777777778 | 0 |
| 0.9222222222222222 | 0 |
| 0.9229166666666666 | 0 |
| 0.9236111111111112 | 0 |
| 0.9243055555555556 | 0 |
| 0.9249999999999999 | 0 |
| 0.9256944444444444 | 0 |
| 0.9263888888888889 | 0 |
| 0.9270833333333334 | 0 |
| 0.9277777777777777 | 0 |
| 0.9284722222222223 | 0 |
| 0.9291666666666667 | 0 |
| 0.9298611111111111 | 0 |
| 0.9305555555555555 | 0 |
| 0.93125 | 0 |
| 0.9319444444444445 | 0 |
| 0.9326388888888889 | 0 |
| 0.9333333333333332 | 0 |
| 0.9340277777777778 | 0 |
| 0.9347222222222222 | 0 |
| 0.9354166666666667 | 0 |
| 0.936111111111111 | 0 |
| 0.9368055555555556 | 0 |
| 0.9375 | 0 |
| 0.9381944444444444 | 0 |
| 0.938888888888889 | 0 |
| 0.9395833333333333 | 0 |
| 0.9402777777777778 | 0 |
| 0.9409722222222222 | 0 |
| 0.9416666666666668 | 0 |
| 0.9423611111111111 | 0 |
| 0.9430555555555555 | 0 |
| 0.94375 | 0 |
| 0.9444444444444445 | 0 |
| 0.9451388888888889 | 0 |
| 0.9458333333333333 | 0 |
| 0.9465277777777777 | 0 |
| 0.9472222222222223 | 0 |
| 0.9479166666666666 | 0 |
| 0.9486111111111111 | 0 |
| 0.9493055555555556 | 0 |
| 0.9500000000000001 | 0 |
| 0.9506944444444444 | 0 |
| 0.9513888888888888 | 0 |
| 0.9520833333333334 | 0 |
| 0.9527777777777778 | 0 |
| 0.9534722222222222 | 0 |
| 0.9541666666666666 | 0 |
| 0.9548611111111112 | 0 |
| 0.9555555555555556 | 0 |
| 0.9562499999999999 | 0 |
| 0.9569444444444444 | 0 |
| 0.9576388888888889 | 0 |
| 0.9583333333333334 | 0 |
| 0.9590277777777777 | 0 |
| 0.9597222222222223 | 0 |
| 0.9604166666666667 | 0 |
| 0.9611111111111111 | 0 |
| 0.9618055555555555 | 0 |
| 0.9625 | 0 |
| 0.9631944444444445 | 0 |
| 0.9638888888888889 | 0 |
| 0.9645833333333332 | 0 |
| 0.9652777777777778 | 0 |
| 0.9659722222222222 | 0 |
| 0.9666666666666667 | 0 |
| 0.967361111111111 | 0 |
| 0.9680555555555556 | 0 |
| 0.96875 | 0 |
| 0.9694444444444444 | 0 |
| 0.970138888888889 | 0 |
| 0.9708333333333333 | 0 |
| 0.9715277777777778 | 0 |
| 0.9722222222222222 | 0 |
| 0.9729166666666668 | 0 |
| 0.9736111111111111 | 0 |
| 0.9743055555555555 | 0 |
| 0.975 | 0 |
| 0.9756944444444445 | 0 |
| 0.9763888888888889 | 0 |
| 0.9770833333333333 | 0 |
| 0.9777777777777777 | 0 |
| 0.9784722222222223 | 0 |
| 0.9791666666666666 | 0 |
| 0.9798611111111111 | 0 |
| 0.9805555555555556 | 0 |
| 0.9812500000000001 | 0 |
| 0.9819444444444444 | 0 |
| 0.9826388888888888 | 0 |
| 0.9833333333333334 | 0 |
| 0.9840277777777778 | 0 |
| 0.9847222222222222 | 0 |
| 0.9854166666666666 | 0 |
| 0.9861111111111112 | 0 |
| 0.9868055555555556 | 0 |
| 0.9874999999999999 | 0 |
| 0.9881944444444444 | 0 |
| 0.9888888888888889 | 0 |
| 0.9895833333333334 | 0 |
| 0.9902777777777777 | 0 |
| 0.9909722222222223 | 0 |
| 0.9916666666666667 | 0 |
| 0.9923611111111111 | 0 |
| 0.9930555555555555 | 0 |
| 0.99375 | 0 |
| 0.9944444444444445 | 0 |
| 0.9951388888888889 | 0 |
| 0.9958333333333332 | 0 |
| 0.9965277777777778 | 0 |
| 0.9972222222222222 | 0 |
| 0.9979166666666667 | 0 |
| 0.998611111111111 | 0 |
| 0.9993055555555556 | 0 |